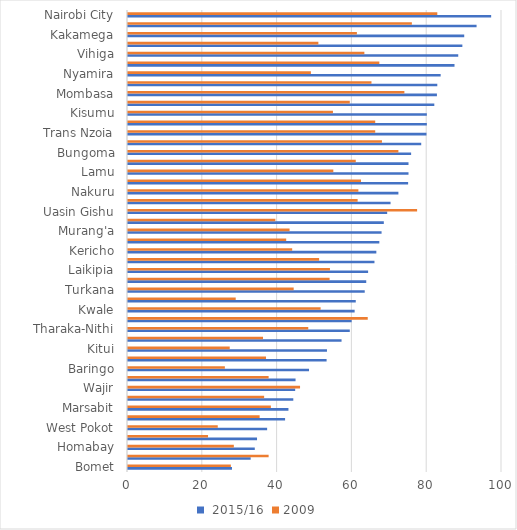
| Category |  2015/16 | 2009 |
|---|---|---|
| Bomet | 27.8 | 27.5 |
| Mandera | 32.8 | 37.6 |
| Homabay | 33.9 | 28.3 |
| Narok | 34.5 | 21.4 |
| West Pokot | 37.2 | 24 |
| Samburu | 42 | 35.2 |
| Marsabit | 42.9 | 38.2 |
| Elgeyo Marakwet | 44.2 | 36.4 |
| Wajir | 44.7 | 46 |
| Nandi | 44.8 | 37.6 |
| Baringo | 48.4 | 25.9 |
| Makueni | 53.1 | 36.9 |
| Kitui | 53.2 | 27.2 |
| Siaya | 57.1 | 36.1 |
| Tharaka-Nithi | 59.3 | 48.2 |
| Garissa | 59.8 | 64.1 |
| Kwale | 60.6 | 51.5 |
| Migori | 60.9 | 28.8 |
| Turkana | 63.3 | 44.3 |
| Kirinyaga | 63.7 | 53.9 |
| Laikipia | 64.2 | 54 |
| Embu | 65.9 | 51.1 |
| Kericho | 66.4 | 43.9 |
| Tana River | 67.2 | 42.3 |
| Murang'a | 67.8 | 43.2 |
| Machakos | 68.4 | 39.4 |
| Uasin Gishu | 69.3 | 77.3 |
| Meru | 70.2 | 61.4 |
| Nakuru | 72.3 | 61.6 |
| Busia | 74.9 | 62.3 |
| Lamu | 75 | 54.9 |
| Isiolo | 75 | 60.9 |
| Bungoma | 75.7 | 72.3 |
| Kilifi | 78.4 | 67.9 |
| Trans Nzoia | 79.8 | 66.1 |
| Taita Taveta | 79.9 | 66.1 |
| Kisumu | 79.9 | 54.8 |
| Nyandarua | 81.9 | 59.3 |
| Mombasa | 82.6 | 73.9 |
| Nyeri | 82.7 | 65.1 |
| Nyamira | 83.6 | 48.9 |
| Kajiado | 87.3 | 67.2 |
| Vihiga | 88.3 | 63.2 |
| Kisii | 89.4 | 50.9 |
| Kakamega | 89.9 | 61.2 |
| Kiambu | 93.2 | 75.9 |
| Nairobi City | 97.1 | 82.7 |